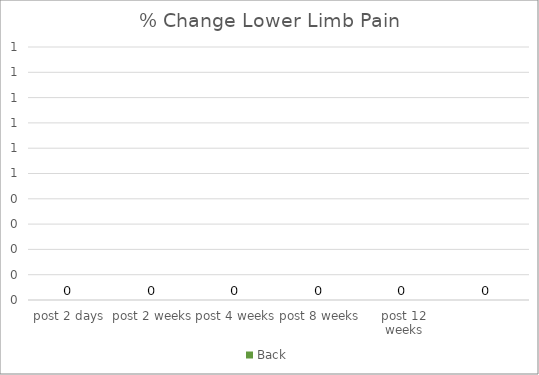
| Category | Back |
|---|---|
| post 2 days | 0 |
| post 2 weeks | 0 |
| post 4 weeks | 0 |
| post 8 weeks | 0 |
| post 12 weeks | 0 |